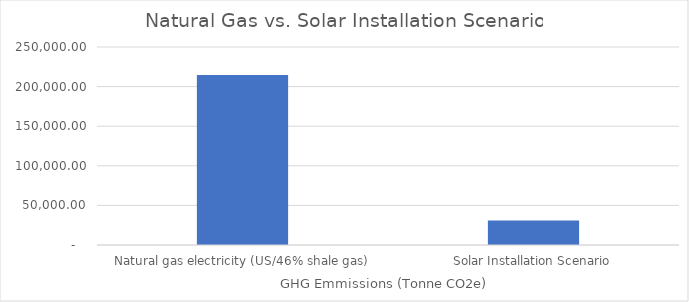
| Category | Series 0 |
|---|---|
| Natural gas electricity (US/46% shale gas) | 214562.708 |
| Solar Installation Scenario | 30934.468 |